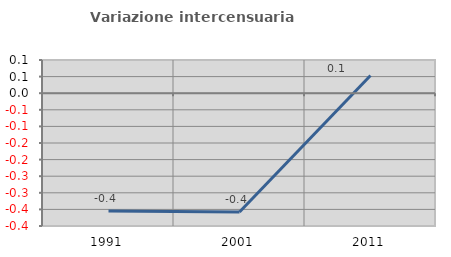
| Category | Variazione intercensuaria annua |
|---|---|
| 1991.0 | -0.355 |
| 2001.0 | -0.358 |
| 2011.0 | 0.053 |